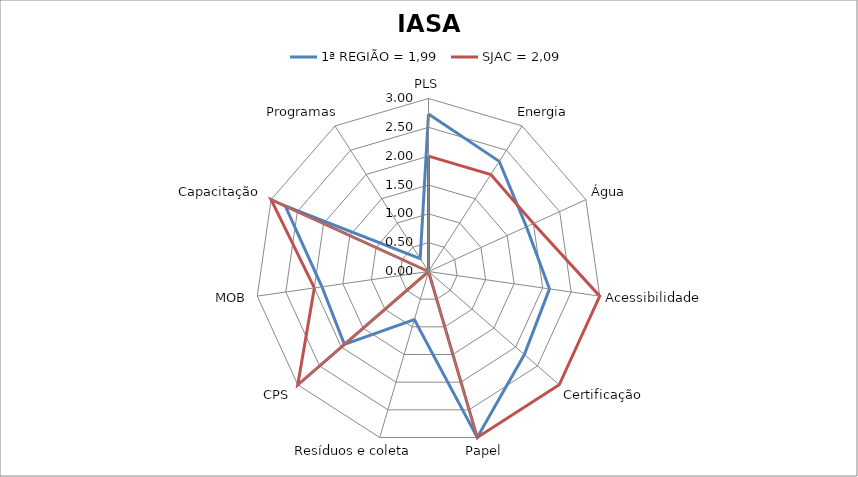
| Category | 1ª REGIÃO = 1,99 | SJAC = 2,09 |
|---|---|---|
| PLS | 2.73 | 2 |
| Energia | 2.27 | 2 |
| Água | 1.867 | 2 |
| Acessibilidade | 2.12 | 3 |
| Certificação | 2.2 | 3 |
| Papel | 3 | 3 |
| Resíduos e coleta | 0.87 | 0 |
| CPS | 1.93 | 3 |
| MOB | 1.867 | 2 |
| Capacitação | 2.73 | 3 |
| Programas | 0.267 | 0 |